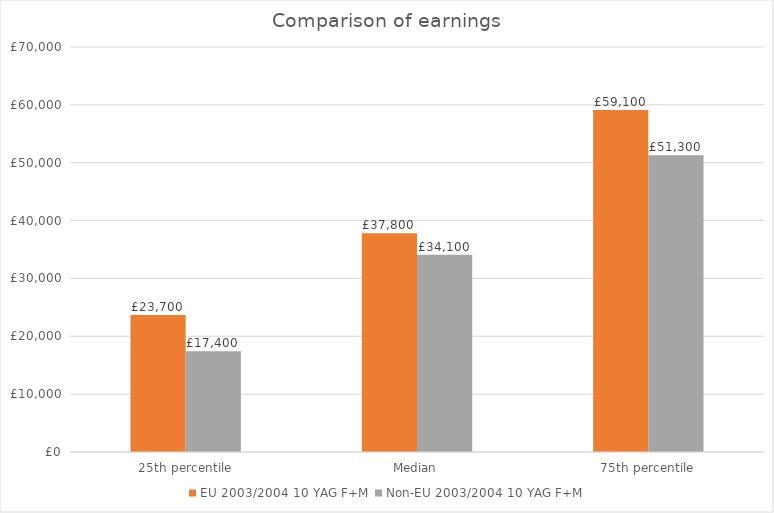
| Category | Series 0 | EU | Non-EU |
|---|---|---|---|
| 25th percentile |  | 23700 | 17400 |
| Median |  | 37800 | 34100 |
| 75th percentile |  | 59100 | 51300 |